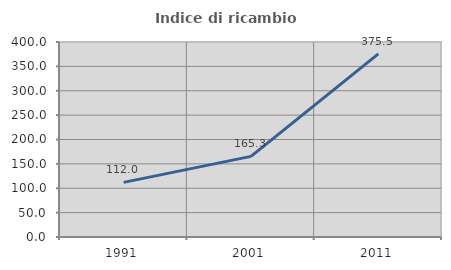
| Category | Indice di ricambio occupazionale  |
|---|---|
| 1991.0 | 112 |
| 2001.0 | 165.333 |
| 2011.0 | 375.51 |